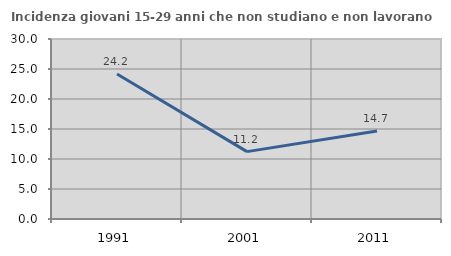
| Category | Incidenza giovani 15-29 anni che non studiano e non lavorano  |
|---|---|
| 1991.0 | 24.165 |
| 2001.0 | 11.228 |
| 2011.0 | 14.671 |